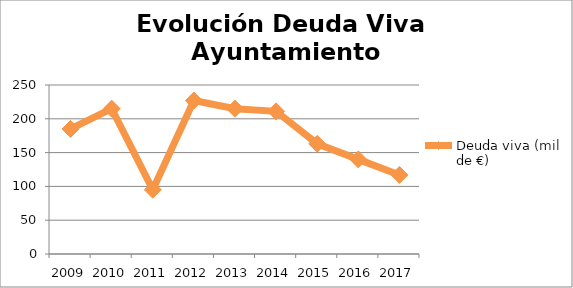
| Category | Deuda viva (miles de €) |
|---|---|
| 2009.0 | 185 |
| 2010.0 | 215 |
| 2011.0 | 95 |
| 2012.0 | 227 |
| 2013.0 | 215 |
| 2014.0 | 211 |
| 2015.0 | 163 |
| 2016.0 | 140 |
| 2017.0 | 117 |